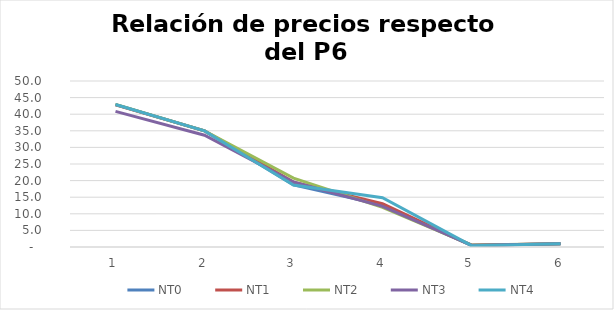
| Category | NT0 | NT1 | NT2 | NT3 | NT4 |
|---|---|---|---|---|---|
| 0 | 42.879 | 42.862 | 42.974 | 40.857 | 42.914 |
| 1 | 35.002 | 34.984 | 34.99 | 33.671 | 34.976 |
| 2 | 18.709 | 19.527 | 20.73 | 19.571 | 18.655 |
| 3 | 12.62 | 13.059 | 11.922 | 12.257 | 14.82 |
| 4 | 0.47 | 0.522 | 0.606 | 0.53 | 0.41 |
| 5 | 1 | 1 | 1 | 1 | 1 |